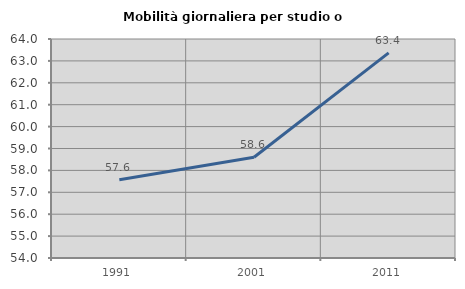
| Category | Mobilità giornaliera per studio o lavoro |
|---|---|
| 1991.0 | 57.568 |
| 2001.0 | 58.599 |
| 2011.0 | 63.367 |